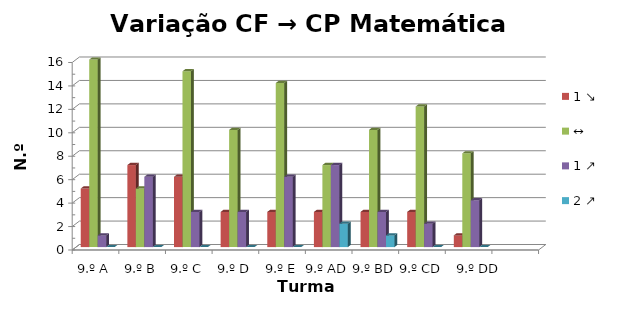
| Category | 1 ↘ | ↔ | 1 ↗ | 2 ↗ |
|---|---|---|---|---|
| 9.º A | 5 | 16 | 1 | 0 |
| 9.º B | 7 | 5 | 6 | 0 |
| 9.º C | 6 | 15 | 3 | 0 |
| 9.º D | 3 | 10 | 3 | 0 |
| 9.º E | 3 | 14 | 6 | 0 |
| 9.º AD | 3 | 7 | 7 | 2 |
| 9.º BD | 3 | 10 | 3 | 1 |
| 9.º CD | 3 | 12 | 2 | 0 |
| 9.º DD | 1 | 8 | 4 | 0 |